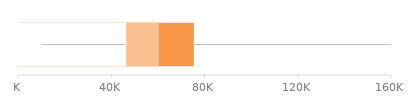
| Category | 75th Percentile | Median | 25th Percentile |
|---|---|---|---|
| 0 | 75000 | 60000 | 46000 |